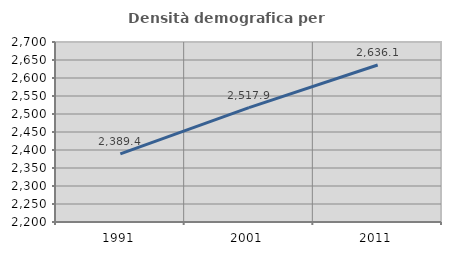
| Category | Densità demografica |
|---|---|
| 1991.0 | 2389.438 |
| 2001.0 | 2517.906 |
| 2011.0 | 2636.141 |